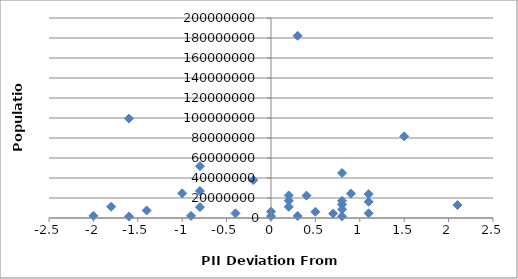
| Category | Population |
|---|---|
| 1.4999999999999991 | 81680000 |
| -0.40000000000000036 | 4662446 |
| 0.8999999999999995 | 24383301 |
| 1.0999999999999996 | 16212000 |
| -0.7999999999999998 | 51820000 |
| 0.7999999999999998 | 45010056 |
| -0.20000000000000018 | 37873253 |
| -1.7999999999999998 | 11262564 |
| 0.20000000000000018 | 11178921 |
| -1.0 | 24692144 |
| 2.1000000000000005 | 12973808 |
| -2.0 | 2155784 |
| -0.9000000000000004 | 2113077 |
| 0.2999999999999998 | 2067000 |
| 1.0999999999999996 | 4709000 |
| -1.6000000000000005 | 1475000 |
| 0.20000000000000018 | 22534532 |
| 0.2999999999999998 | 182202000 |
| -0.7999999999999998 | 10879829 |
| -1.4000000000000004 | 7552318 |
| -0.7999999999999998 | 27000000 |
| 1.0999999999999996 | 23919000 |
| 0.7000000000000002 | 4503000 |
| 0.5 | 6190280 |
| 0.7999999999999998 | 8746128 |
| 0.7999999999999998 | 1693398 |
| 0.7999999999999998 | 13567338 |
| 0.0 | 1882450 |
| 0.20000000000000018 | 17322796 |
| 0.7999999999999998 | 17138707 |
| -1.6000000000000005 | 99465819 |
| 0.0 | 6380803 |
| 0.39999999999999947 | 22434363 |